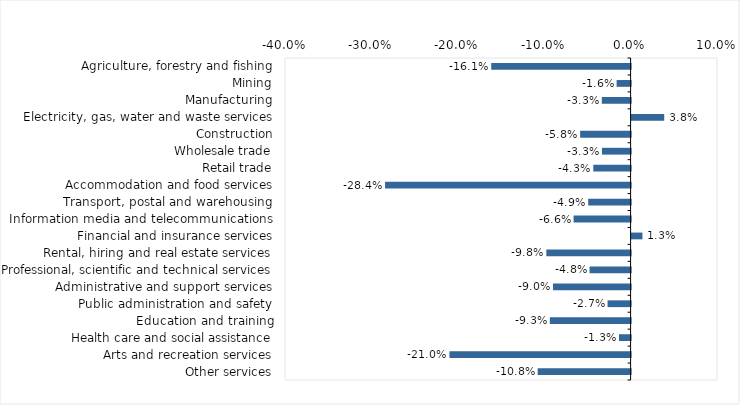
| Category | This week |
|---|---|
| Agriculture, forestry and fishing | -0.161 |
| Mining | -0.016 |
| Manufacturing | -0.033 |
| Electricity, gas, water and waste services | 0.038 |
| Construction | -0.058 |
| Wholesale trade | -0.033 |
| Retail trade | -0.043 |
| Accommodation and food services | -0.284 |
| Transport, postal and warehousing | -0.049 |
| Information media and telecommunications | -0.066 |
| Financial and insurance services | 0.013 |
| Rental, hiring and real estate services | -0.098 |
| Professional, scientific and technical services | -0.048 |
| Administrative and support services | -0.09 |
| Public administration and safety | -0.027 |
| Education and training | -0.093 |
| Health care and social assistance | -0.013 |
| Arts and recreation services | -0.21 |
| Other services | -0.108 |